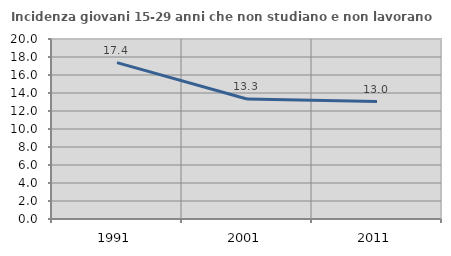
| Category | Incidenza giovani 15-29 anni che non studiano e non lavorano  |
|---|---|
| 1991.0 | 17.379 |
| 2001.0 | 13.333 |
| 2011.0 | 13.043 |